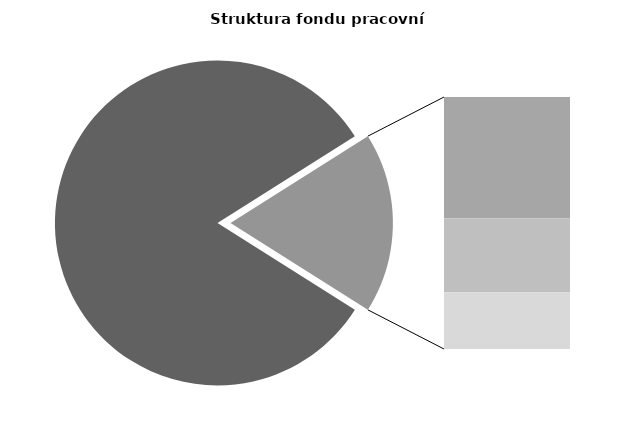
| Category | Series 0 |
|---|---|
| Průměrná měsíční odpracovaná doba bez přesčasu | 139.575 |
| Dovolená | 14.676 |
| Nemoc | 8.987 |
| Jiné | 6.861 |